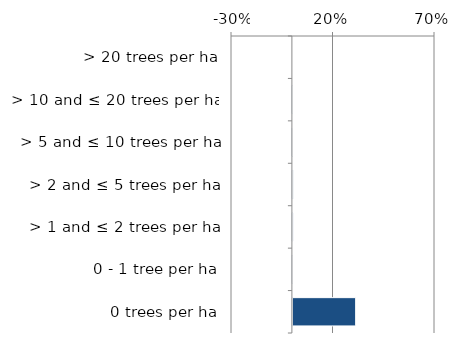
| Category | Native |
|---|---|
| 0 trees per ha | 0.309 |
| 0 - 1 tree per ha | 0.001 |
| > 1 and ≤ 2 trees per ha | 0.001 |
| > 2 and ≤ 5 trees per ha | 0.001 |
| > 5 and ≤ 10 trees per ha | 0 |
| > 10 and ≤ 20 trees per ha | 0 |
| > 20 trees per ha | 0 |